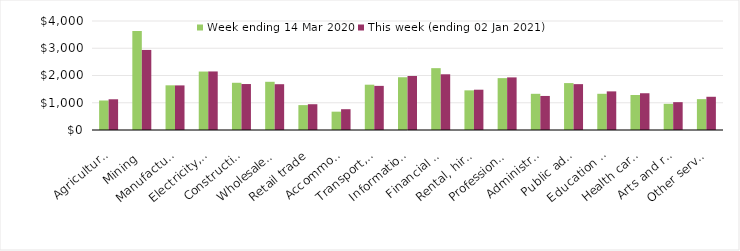
| Category | Week ending 14 Mar 2020 | This week (ending 02 Jan 2021) |
|---|---|---|
| Agriculture, forestry and fishing | 1082.81 | 1127.57 |
| Mining | 3629.56 | 2938.05 |
| Manufacturing | 1639.97 | 1636.59 |
| Electricity, gas, water and waste services | 2145.04 | 2148.86 |
| Construction | 1732.87 | 1687.04 |
| Wholesale trade | 1769.03 | 1680.71 |
| Retail trade | 913.31 | 946.03 |
| Accommodation and food services | 672.84 | 763.14 |
| Transport, postal and warehousing | 1662.5 | 1619.18 |
| Information media and telecommunications | 1935.89 | 1982.47 |
| Financial and insurance services | 2269.52 | 2044.56 |
| Rental, hiring and real estate services | 1454.7 | 1478.72 |
| Professional, scientific and technical services | 1903.57 | 1930.56 |
| Administrative and support services | 1328.12 | 1249.39 |
| Public administration and safety | 1721.42 | 1683.18 |
| Education and training | 1328.63 | 1417.27 |
| Health care and social assistance | 1285.23 | 1349.01 |
| Arts and recreation services | 960.62 | 1021.78 |
| Other services | 1132.68 | 1219.11 |